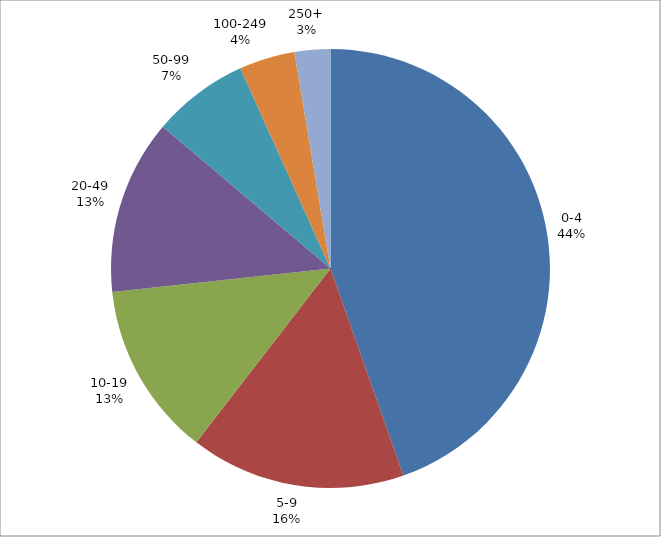
| Category | Series 0 |
|---|---|
| 0-4 | 1458 |
| 5-9 | 518 |
| 10-19 | 419 |
| 20-49 | 421 |
| 50-99 | 232 |
| 100-249 | 134 |
| 250+ | 86 |